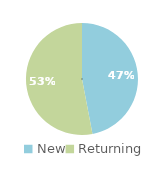
| Category | Series 0 |
|---|---|
| New | 0.47 |
| Returning | 0.53 |